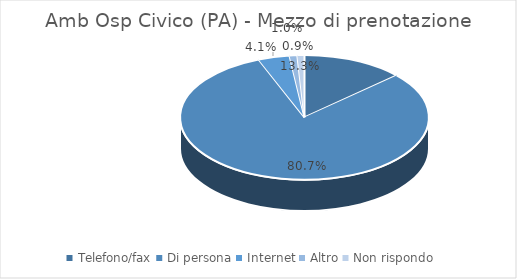
| Category | Amb Osp Civico (PA) |
|---|---|
| Telefono/fax | 0.133 |
| Di persona | 0.807 |
| Internet | 0.041 |
| Altro | 0.01 |
| Non rispondo | 0.009 |